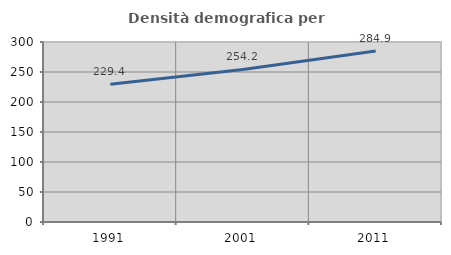
| Category | Densità demografica |
|---|---|
| 1991.0 | 229.401 |
| 2001.0 | 254.237 |
| 2011.0 | 284.947 |